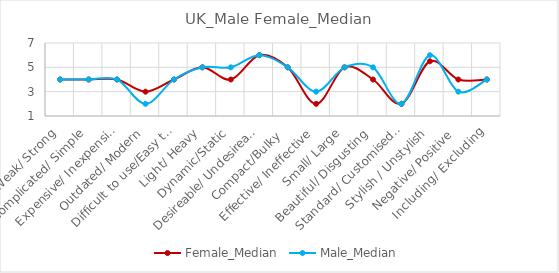
| Category | Female_Median | Male_Median |
|---|---|---|
| Weak/ Strong | 4 | 4 |
| Complicated/ Simple | 4 | 4 |
| Expensive/ Inexpensive | 4 | 4 |
| Outdated/ Modern | 3 | 2 |
| Difficult to use/Easy to use | 4 | 4 |
| Light/ Heavy | 5 | 5 |
| Dynamic/Static | 4 | 5 |
| Desireable/ Undesireable | 6 | 6 |
| Compact/Bulky  | 5 | 5 |
| Effective/ Ineffective | 2 | 3 |
| Small/ Large | 5 | 5 |
| Beautiful/ Disgusting | 4 | 5 |
| Standard/ Customised   | 2 | 2 |
| Stylish / Unstylish | 5.5 | 6 |
| Negative/ Positive | 4 | 3 |
| Including/ Excluding | 4 | 4 |